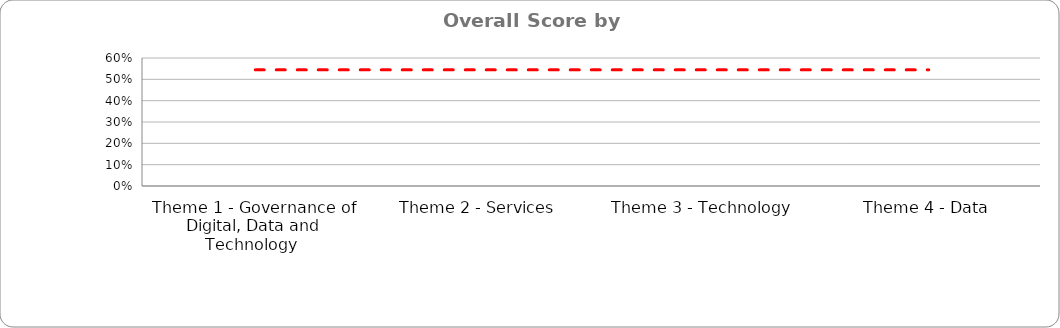
| Category | Series 0 |
|---|---|
| Theme 1 - Governance of Digital, Data and Technology  | 0 |
| Theme 2 - Services | 0 |
| Theme 3 - Technology | 0 |
| Theme 4 - Data | 0 |